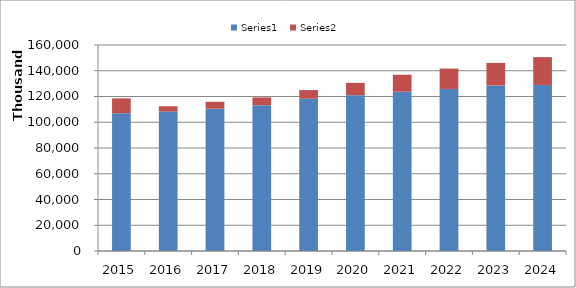
| Category | Series 0 | Series 1 |
|---|---|---|
| 2015.0 | 106992174 | 11538845 |
| 2016.0 | 108281643 | 4127675 |
| 2017.0 | 110530972 | 5378400 |
| 2018.0 | 113264977 | 6029408 |
| 2019.0 | 118355238 | 6629213 |
| 2020.0 | 121006865 | 9599774 |
| 2021.0 | 123724608 | 13166969 |
| 2022.0 | 125855292 | 15805899 |
| 2023.0 | 128586817 | 17468732 |
| 2024.0 | 128983540 | 21615231 |